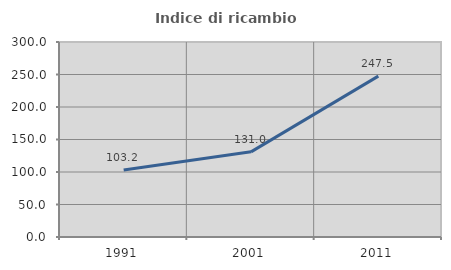
| Category | Indice di ricambio occupazionale  |
|---|---|
| 1991.0 | 103.171 |
| 2001.0 | 131.014 |
| 2011.0 | 247.489 |